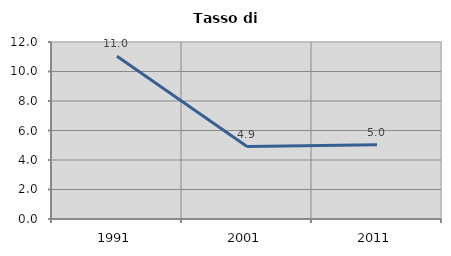
| Category | Tasso di disoccupazione   |
|---|---|
| 1991.0 | 11.029 |
| 2001.0 | 4.915 |
| 2011.0 | 5.028 |